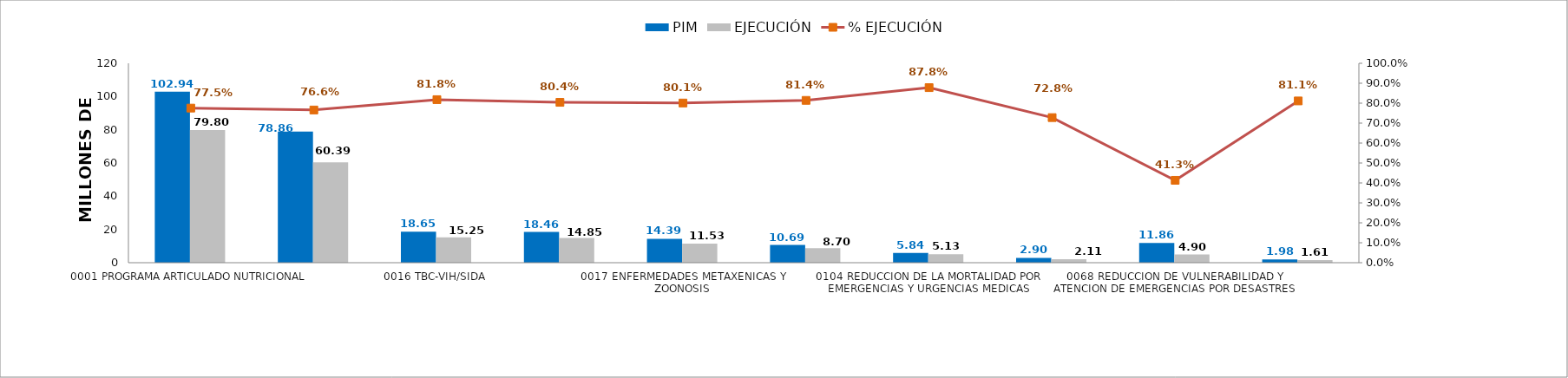
| Category | PIM | EJECUCIÓN |
|---|---|---|
| 0001 PROGRAMA ARTICULADO NUTRICIONAL | 102.941 | 79.802 |
| 0002 SALUD MATERNO NEONATAL | 78.855 | 60.388 |
| 0016 TBC-VIH/SIDA | 18.646 | 15.247 |
| 0018 ENFERMEDADES NO TRANSMISIBLES | 18.462 | 14.847 |
| 0017 ENFERMEDADES METAXENICAS Y ZOONOSIS | 14.392 | 11.525 |
| 0024 PREVENCION Y CONTROL DEL CANCER | 10.693 | 8.704 |
| 0104 REDUCCION DE LA MORTALIDAD POR EMERGENCIAS Y URGENCIAS MEDICAS | 5.841 | 5.128 |
| 0131 CONTROL Y PREVENCION EN SALUD MENTAL | 2.904 | 2.113 |
| 0068 REDUCCION DE VULNERABILIDAD Y ATENCION DE EMERGENCIAS POR DESASTRES | 11.861 | 4.9 |
| 0129 PREVENCION Y MANEJO DE CONDICIONES SECUNDARIAS DE SALUD EN PERSONAS CON DISCAPACIDAD | 1.983 | 1.608 |